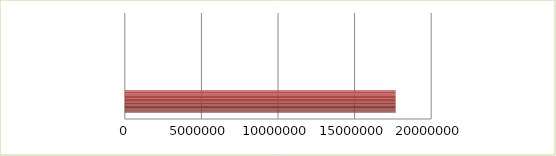
| Category | Series 0 | Series 1 |
|---|---|---|
| 0 | 2.5 | 17681410 |
| 1 | 2.6 | 0 |
| 2 | 2.7 | 0 |